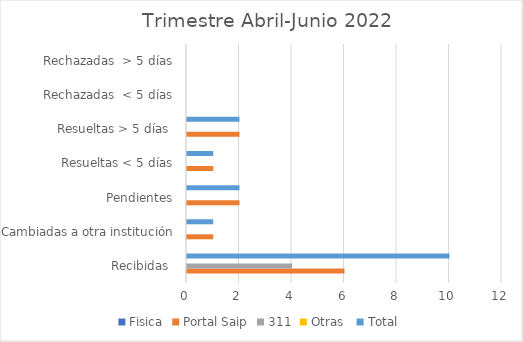
| Category | Fisica | Portal Saip | 311 | Otras  | Total |
|---|---|---|---|---|---|
| Recibidas  | 0 | 6 | 4 | 0 | 10 |
| Cambiadas a otra institución | 0 | 1 | 0 | 0 | 1 |
| Pendientes | 0 | 2 | 0 | 0 | 2 |
| Resueltas < 5 días | 0 | 1 | 0 | 0 | 1 |
| Resueltas > 5 días  | 0 | 2 | 0 | 0 | 2 |
| Rechazadas  < 5 días | 0 | 0 | 0 | 0 | 0 |
| Rechazadas  > 5 días | 0 | 0 | 0 | 0 | 0 |